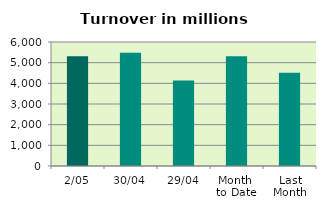
| Category | Series 0 |
|---|---|
| 2/05 | 5311.973 |
| 30/04 | 5477.958 |
| 29/04 | 4133.23 |
| Month 
to Date | 5311.973 |
| Last
Month | 4514.737 |